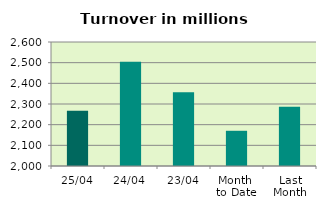
| Category | Series 0 |
|---|---|
| 25/04 | 2267.64 |
| 24/04 | 2504.204 |
| 23/04 | 2357.058 |
| Month 
to Date | 2170.395 |
| Last
Month | 2286.259 |